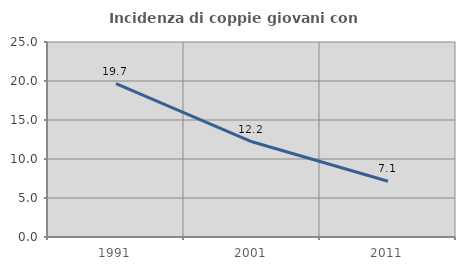
| Category | Incidenza di coppie giovani con figli |
|---|---|
| 1991.0 | 19.679 |
| 2001.0 | 12.204 |
| 2011.0 | 7.139 |